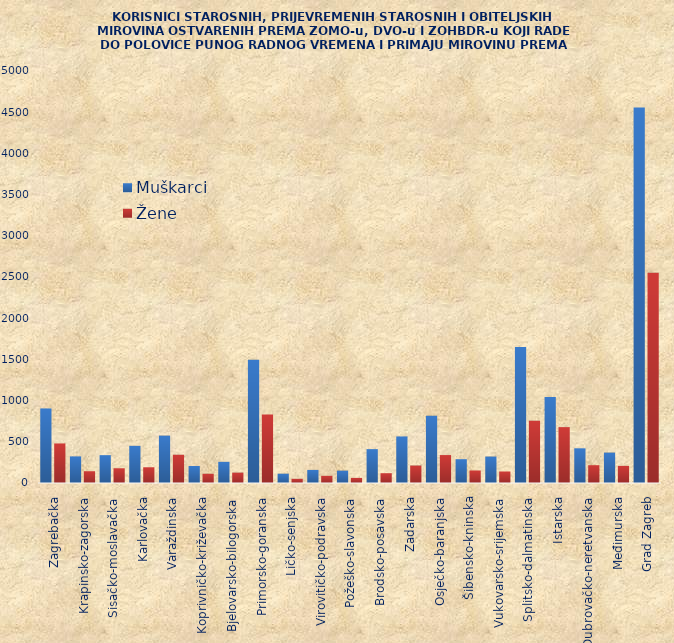
| Category | Muškarci | Žene |
|---|---|---|
| Zagrebačka | 905 | 480 |
| Krapinsko-zagorska | 323 | 143 |
| Sisačko-moslavačka | 338 | 179 |
| Karlovačka | 451 | 191 |
| Varaždinska | 575 | 343 |
| Koprivničko-križevačka | 206 | 112 |
| Bjelovarsko-bilogorska | 257 | 126 |
| Primorsko-goranska | 1497 | 832 |
| Ličko-senjska | 113 | 51 |
| Virovitičko-podravska | 159 | 87 |
| Požeško-slavonska | 150 | 62 |
| Brodsko-posavska | 411 | 119 |
| Zadarska | 565 | 212 |
| Osječko-baranjska | 816 | 339 |
| Šibensko-kninska | 289 | 152 |
| Vukovarsko-srijemska | 321 | 140 |
| Splitsko-dalmatinska | 1652 | 756 |
| Istarska | 1044 | 678 |
| Dubrovačko-neretvanska | 421 | 216 |
| Međimurska | 369 | 208 |
| Grad Zagreb | 4558 | 2553 |